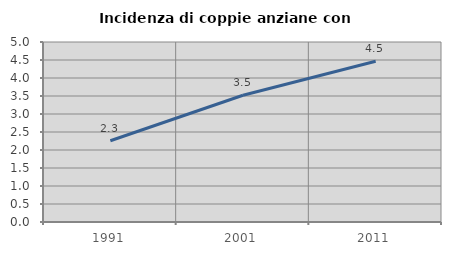
| Category | Incidenza di coppie anziane con figli |
|---|---|
| 1991.0 | 2.258 |
| 2001.0 | 3.522 |
| 2011.0 | 4.464 |